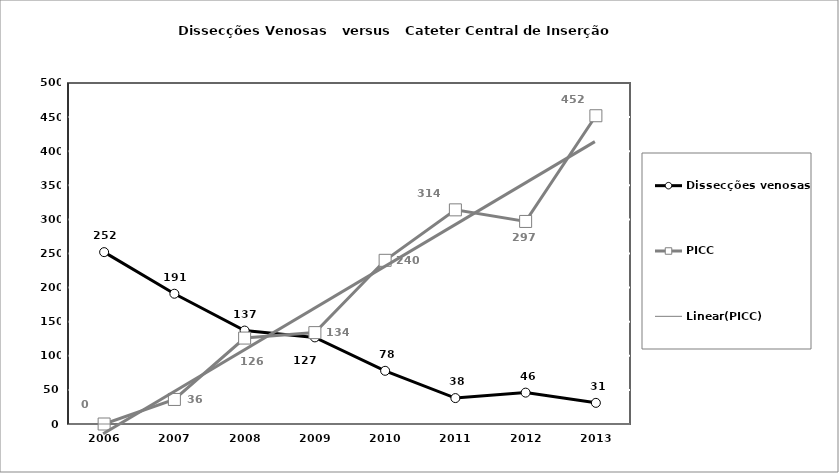
| Category | Dissecções venosas | PICC |
|---|---|---|
| 2006.0 | 252 | 0 |
| 2007.0 | 191 | 36 |
| 2008.0 | 137 | 126 |
| 2009.0 | 127 | 134 |
| 2010.0 | 78 | 240 |
| 2011.0 | 38 | 314 |
| 2012.0 | 46 | 297 |
| 2013.0 | 31 | 452 |